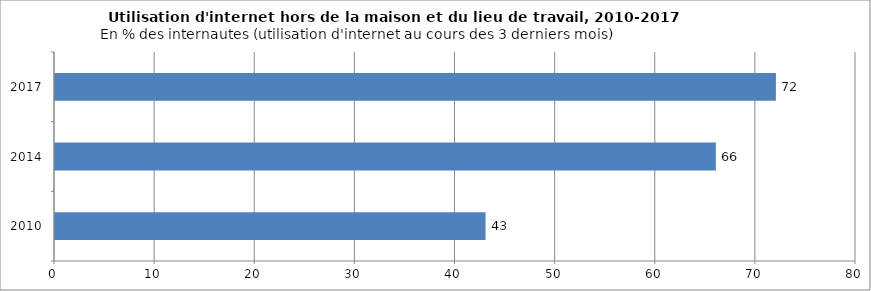
| Category | Internautes mobiles |
|---|---|
| 2010.0 | 43 |
| 2014.0 | 66 |
| 2017.0 | 72 |